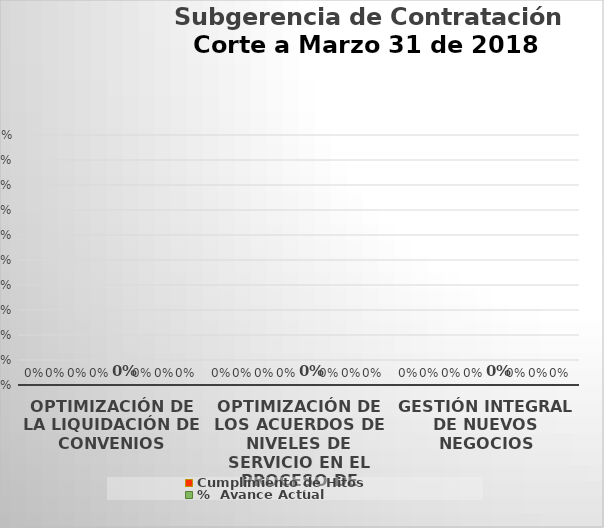
| Category | Cumplimiento de Hitos | %  Avance Actual | % Avance Esperado Temporal | Cumplimiento Temporal |
|---|---|---|---|---|
| OPTIMIZACIÓN DE LA LIQUIDACIÓN DE CONVENIOS | 0 | 0 | 0 | 0 |
| OPTIMIZACIÓN DE LOS ACUERDOS DE NIVELES DE SERVICIO EN EL PROCESO DE GESTIÓN DE PROVEEDORES | 0 | 0 | 0 | 0 |
| GESTIÓN INTEGRAL DE NUEVOS NEGOCIOS | 0 | 0 | 0 | 0 |